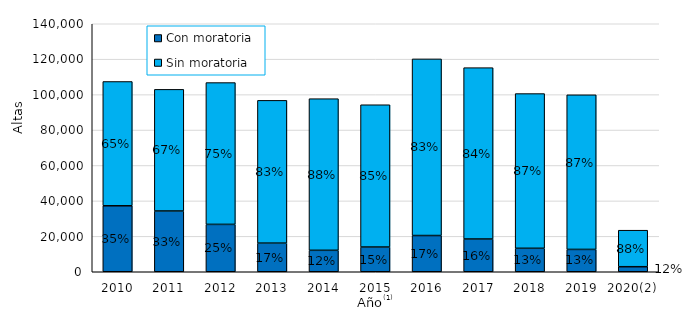
| Category | Con moratoria | Sin moratoria |
|---|---|---|
| 2010 | 37246 | 70158 |
| 2011 | 34301 | 68662 |
| 2012 | 26736 | 80055 |
| 2013 | 16157 | 80596 |
| 2014 | 12109 | 85592 |
| 2015 | 13961 | 80314 |
| 2016 | 20454 | 99705 |
| 2017 | 18480 | 96741 |
| 2018 | 13243 | 87344 |
| 2019 | 12609 | 87284 |
| 2020(2) | 2848 | 20606 |